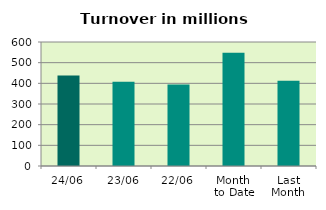
| Category | Series 0 |
|---|---|
| 24/06 | 438.469 |
| 23/06 | 407.8 |
| 22/06 | 393.927 |
| Month 
to Date | 548.021 |
| Last
Month | 412.236 |